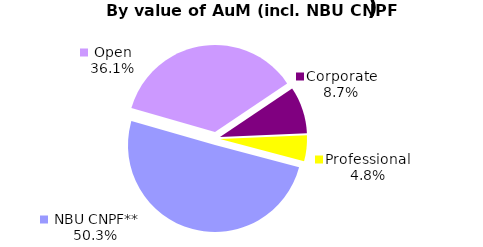
| Category | Series 0 |
|---|---|
| Open | 991.538 |
| Corporate | 239.869 |
| Professional | 132.731 |
|  NBU CNPF** | 1381.063 |